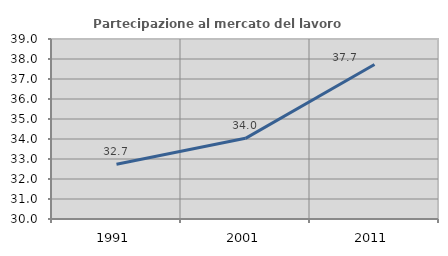
| Category | Partecipazione al mercato del lavoro  femminile |
|---|---|
| 1991.0 | 32.734 |
| 2001.0 | 34.034 |
| 2011.0 | 37.727 |